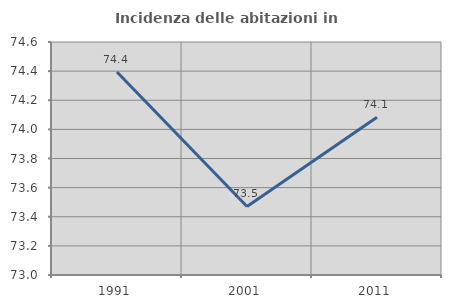
| Category | Incidenza delle abitazioni in proprietà  |
|---|---|
| 1991.0 | 74.394 |
| 2001.0 | 73.471 |
| 2011.0 | 74.083 |